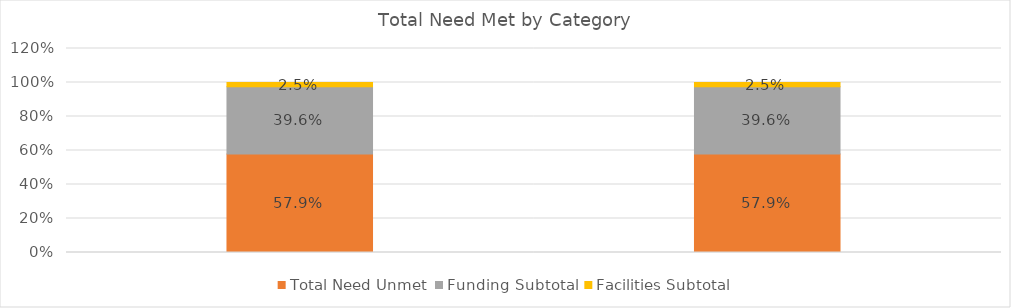
| Category | Total Need Unmet | Funding Subtotal | Facilities Subtotal |
|---|---|---|---|
|  | 0.579 | 0.396 | 0.025 |
|  | 0.579 | 0.396 | 0.025 |